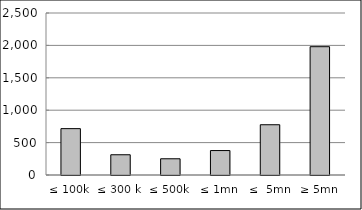
| Category | Series 0 |
|---|---|
| ≤ 100k | 715497107.021 |
| ≤ 300 k | 312287655.85 |
| ≤ 500k | 250498029.31 |
| ≤ 1mn | 377320789.01 |
| ≤  5mn | 775490562.508 |
| ≥ 5mn | 1980022302.031 |